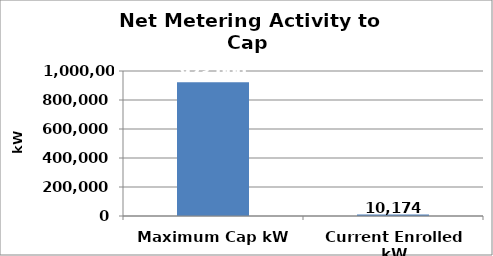
| Category | kW |
|---|---|
| Maximum Cap kW | 923000 |
| Current Enrolled kW | 10174 |